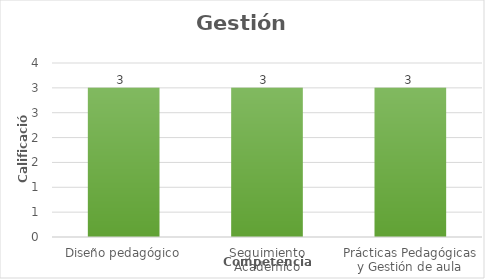
| Category | Series 0 |
|---|---|
| Diseño pedagógico | 3 |
| Seguimiento Académico | 3 |
| Prácticas Pedagógicas y Gestión de aula | 3 |